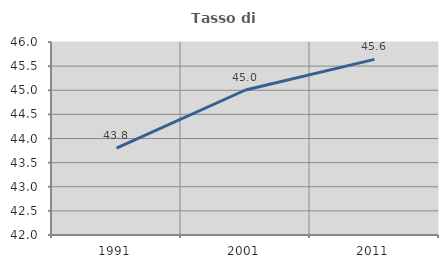
| Category | Tasso di occupazione   |
|---|---|
| 1991.0 | 43.803 |
| 2001.0 | 45.005 |
| 2011.0 | 45.64 |